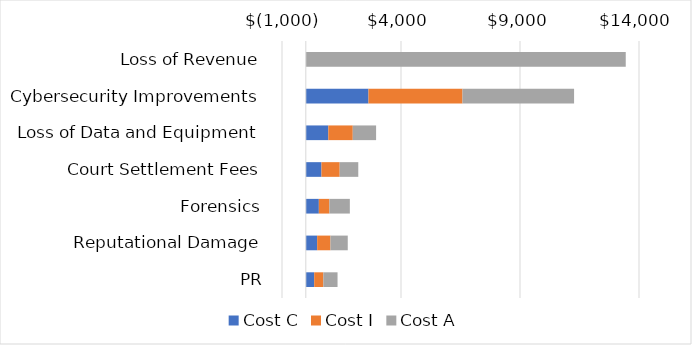
| Category | Cost C | Cost I | Cost A |
|---|---|---|---|
| Loss of Revenue | 0 | 0 | 13443.239 |
| Cybersecurity Improvements | 2633.664 | 3950.495 | 4687.921 |
| Loss of Data and Equipment | 945.749 | 1028.051 | 979.776 |
| Court Settlement Fees | 658.416 | 765.343 | 781.32 |
| Forensics | 548.065 | 442.851 | 859.921 |
| Reputational Damage | 476.956 | 559.785 | 726.315 |
| PR | 353.043 | 384.91 | 595.679 |